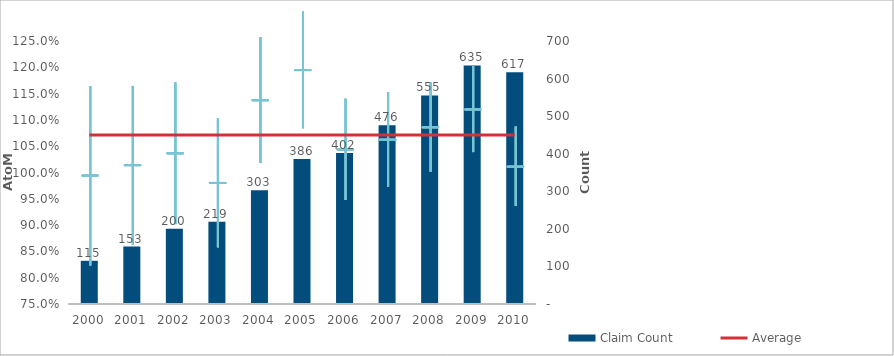
| Category | Claim Count |
|---|---|
| 0 | 115 |
| 1 | 153 |
| 2 | 200 |
| 3 | 219 |
| 4 | 303 |
| 5 | 386 |
| 6 | 402 |
| 7 | 476 |
| 8 | 555 |
| 9 | 635 |
| 10 | 617 |